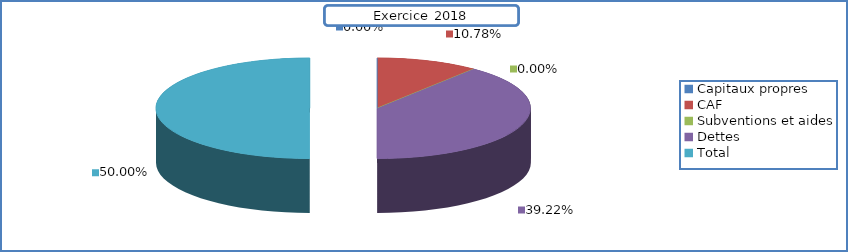
| Category | Series 0 |
|---|---|
| Capitaux propres | 0 |
| CAF | 20034.25 |
| Subventions et aides | 0 |
| Dettes | 72851.2 |
| Total | 92885.45 |